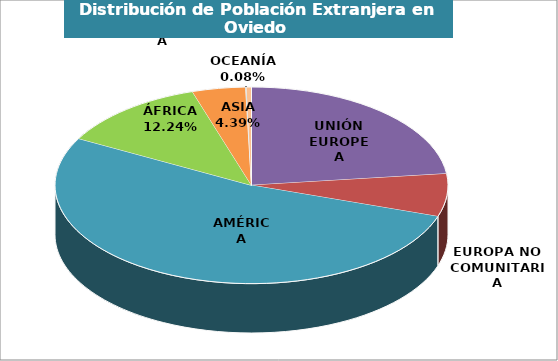
| Category | Series 0 |
|---|---|
| UNIÓN EUROPEA | 4000 |
| EUROPA NO COMUNITARIA | 1216 |
| AMÉRICA | 9124 |
| ÁFRICA | 2118 |
| ASIA | 759 |
| OCEANÍA | 13 |
| APÁTRIDA | 70 |